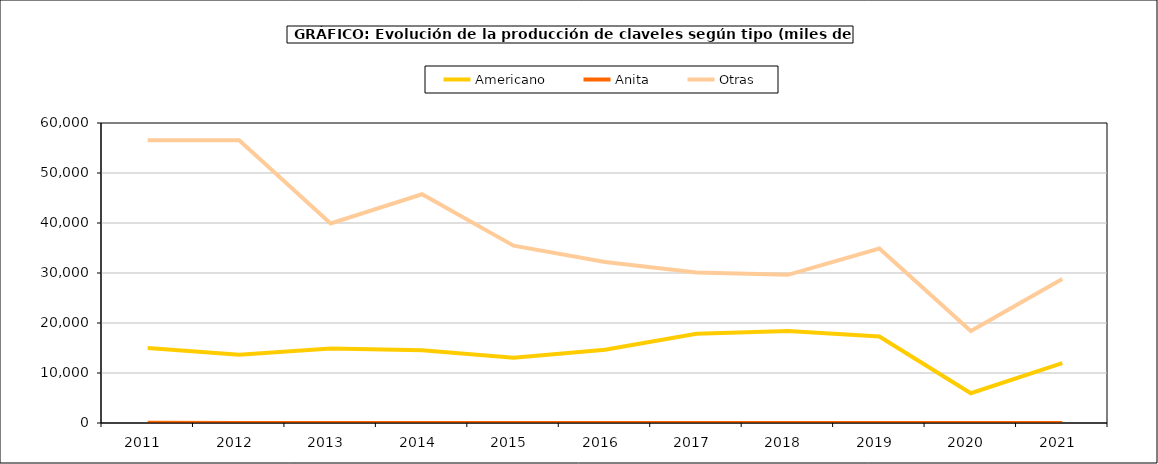
| Category | Americano | Anita | Otras |
|---|---|---|---|
| 2011.0 | 15002 | 54 | 56550 |
| 2012.0 | 13658 | 0 | 56550 |
| 2013.0 | 14880 | 0 | 39920 |
| 2014.0 | 14528 | 0 | 45749 |
| 2015.0 | 13065 | 0 | 35460 |
| 2016.0 | 14654 | 0 | 32202 |
| 2017.0 | 17866 | 0 | 30124 |
| 2018.0 | 18413 | 0 | 29630 |
| 2019.0 | 17283 | 3 | 34898 |
| 2020.0 | 5959 | 7 | 18397 |
| 2021.0 | 11977 | 7 | 28805 |